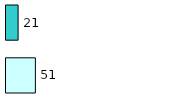
| Category | Series 0 | Series 1 |
|---|---|---|
| 0 | 51 | 21 |